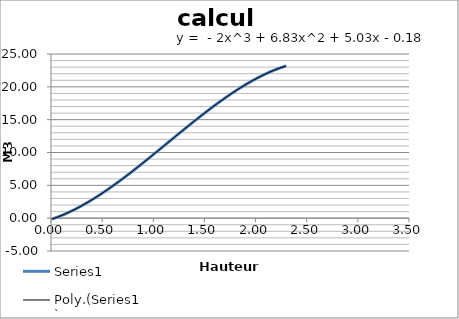
| Category | Series 0 |
|---|---|
| 0.01 | -0.129 |
| 0.02 | -0.077 |
| 0.03 | -0.023 |
| 0.04 | 0.032 |
| 0.05 | 0.088 |
| 0.06 | 0.146 |
| 0.07 | 0.205 |
| 0.08 | 0.265 |
| 0.09 | 0.327 |
| 0.1 | 0.389 |
| 0.11 | 0.453 |
| 0.12 | 0.518 |
| 0.13 | 0.585 |
| 0.14 | 0.653 |
| 0.15 | 0.721 |
| 0.16 | 0.791 |
| 0.17 | 0.863 |
| 0.18 | 0.935 |
| 0.19 | 1.009 |
| 0.2 | 1.083 |
| 0.21 | 1.159 |
| 0.22 | 1.236 |
| 0.23 | 1.314 |
| 0.24 | 1.393 |
| 0.25 | 1.473 |
| 0.26 | 1.554 |
| 0.27 | 1.637 |
| 0.28 | 1.72 |
| 0.29 | 1.804 |
| 0.3 | 1.89 |
| 0.31 | 1.976 |
| 0.32 | 2.063 |
| 0.33 | 2.152 |
| 0.34 | 2.241 |
| 0.35 | 2.331 |
| 0.36 | 2.423 |
| 0.37 | 2.515 |
| 0.38 | 2.608 |
| 0.39 | 2.702 |
| 0.4 | 2.797 |
| 0.41 | 2.893 |
| 0.42 | 2.989 |
| 0.43 | 3.087 |
| 0.44 | 3.185 |
| 0.45 | 3.284 |
| 0.46 | 3.384 |
| 0.47 | 3.485 |
| 0.48 | 3.587 |
| 0.49 | 3.689 |
| 0.5 | 3.792 |
| 0.51 | 3.896 |
| 0.52 | 4.001 |
| 0.53 | 4.107 |
| 0.54 | 4.213 |
| 0.55 | 4.32 |
| 0.56 | 4.427 |
| 0.57 | 4.536 |
| 0.58 | 4.645 |
| 0.59 | 4.754 |
| 0.6 | 4.865 |
| 0.61 | 4.976 |
| 0.62 | 5.087 |
| 0.63 | 5.2 |
| 0.64 | 5.312 |
| 0.65 | 5.426 |
| 0.66 | 5.54 |
| 0.67 | 5.655 |
| 0.68 | 5.77 |
| 0.69 | 5.885 |
| 0.7 | 6.002 |
| 0.71 | 6.118 |
| 0.72 | 6.236 |
| 0.73 | 6.354 |
| 0.74 | 6.472 |
| 0.75 | 6.591 |
| 0.76 | 6.71 |
| 0.77 | 6.83 |
| 0.78 | 6.95 |
| 0.79 | 7.07 |
| 0.8 | 7.191 |
| 0.81 | 7.313 |
| 0.82 | 7.434 |
| 0.83 | 7.557 |
| 0.84 | 7.679 |
| 0.85 | 7.802 |
| 0.86 | 7.925 |
| 0.87 | 8.049 |
| 0.88 | 8.173 |
| 0.89 | 8.297 |
| 0.9 | 8.421 |
| 0.91 | 8.546 |
| 0.92 | 8.671 |
| 0.93 | 8.796 |
| 0.94 | 8.922 |
| 0.95 | 9.048 |
| 0.96 | 9.174 |
| 0.97 | 9.3 |
| 0.98 | 9.427 |
| 0.99 | 9.553 |
| 1.0 | 9.68 |
| 1.01 | 9.807 |
| 1.02 | 9.934 |
| 1.03 | 10.061 |
| 1.04 | 10.189 |
| 1.05 | 10.316 |
| 1.06 | 10.444 |
| 1.07 | 10.572 |
| 1.08 | 10.699 |
| 1.09 | 10.827 |
| 1.1 | 10.955 |
| 1.11 | 11.083 |
| 1.12 | 11.211 |
| 1.13 | 11.339 |
| 1.14 | 11.467 |
| 1.15 | 11.595 |
| 1.16 | 11.723 |
| 1.17 | 11.851 |
| 1.18 | 11.979 |
| 1.19 | 12.107 |
| 1.2 | 12.235 |
| 1.21 | 12.363 |
| 1.22 | 12.491 |
| 1.23 | 12.618 |
| 1.24 | 12.746 |
| 1.25 | 12.873 |
| 1.26 | 13 |
| 1.27 | 13.127 |
| 1.28 | 13.254 |
| 1.29 | 13.381 |
| 1.3 | 13.508 |
| 1.31 | 13.634 |
| 1.32 | 13.76 |
| 1.33 | 13.886 |
| 1.34 | 14.012 |
| 1.35 | 14.137 |
| 1.36 | 14.263 |
| 1.37 | 14.388 |
| 1.38 | 14.512 |
| 1.39 | 14.637 |
| 1.4 | 14.761 |
| 1.41 | 14.885 |
| 1.42 | 15.008 |
| 1.43 | 15.131 |
| 1.44 | 15.254 |
| 1.45 | 15.376 |
| 1.46 | 15.498 |
| 1.47 | 15.62 |
| 1.48 | 15.741 |
| 1.49 | 15.862 |
| 1.5 | 15.983 |
| 1.51 | 16.102 |
| 1.52 | 16.222 |
| 1.53 | 16.341 |
| 1.54 | 16.46 |
| 1.55 | 16.578 |
| 1.56 | 16.695 |
| 1.57 | 16.813 |
| 1.58 | 16.929 |
| 1.59 | 17.045 |
| 1.6 | 17.161 |
| 1.61 | 17.276 |
| 1.62 | 17.39 |
| 1.63 | 17.504 |
| 1.64 | 17.617 |
| 1.65 | 17.73 |
| 1.66 | 17.842 |
| 1.67 | 17.953 |
| 1.68 | 18.064 |
| 1.69 | 18.174 |
| 1.7 | 18.284 |
| 1.71 | 18.392 |
| 1.72 | 18.501 |
| 1.73 | 18.608 |
| 1.74 | 18.715 |
| 1.75 | 18.821 |
| 1.76 | 18.926 |
| 1.77 | 19.03 |
| 1.78 | 19.134 |
| 1.79 | 19.237 |
| 1.8 | 19.339 |
| 1.81 | 19.441 |
| 1.82 | 19.541 |
| 1.83 | 19.641 |
| 1.84 | 19.74 |
| 1.85 | 19.838 |
| 1.86 | 19.935 |
| 1.87 | 20.032 |
| 1.88 | 20.127 |
| 1.89 | 20.222 |
| 1.9 | 20.315 |
| 1.91 | 20.408 |
| 1.92 | 20.5 |
| 1.93 | 20.591 |
| 1.94 | 20.681 |
| 1.95 | 20.77 |
| 1.96 | 20.858 |
| 1.97 | 20.945 |
| 1.98 | 21.031 |
| 1.99 | 21.116 |
| 2.0 | 21.2 |
| 2.01 | 21.283 |
| 2.02 | 21.365 |
| 2.03 | 21.446 |
| 2.04 | 21.526 |
| 2.05 | 21.604 |
| 2.06 | 21.682 |
| 2.07 | 21.758 |
| 2.08 | 21.834 |
| 2.09 | 21.908 |
| 2.1 | 21.981 |
| 2.11 | 22.053 |
| 2.12 | 22.124 |
| 2.13 | 22.194 |
| 2.14 | 22.262 |
| 2.15 | 22.329 |
| 2.16 | 22.395 |
| 2.17 | 22.46 |
| 2.18 | 22.524 |
| 2.19 | 22.586 |
| 2.2 | 22.647 |
| 2.21 | 22.707 |
| 2.22 | 22.765 |
| 2.23 | 22.823 |
| 2.24 | 22.879 |
| 2.25 | 22.933 |
| 2.26 | 22.986 |
| 2.27 | 23.038 |
| 2.28 | 23.089 |
| 2.29 | 23.138 |
| 2.3 | 23.186 |